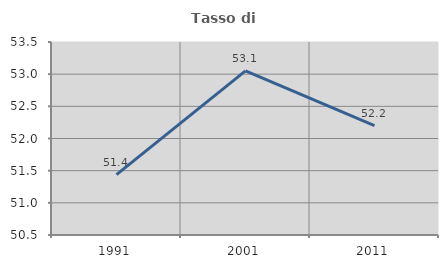
| Category | Tasso di occupazione   |
|---|---|
| 1991.0 | 51.439 |
| 2001.0 | 53.051 |
| 2011.0 | 52.201 |